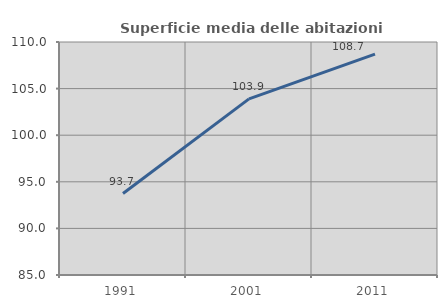
| Category | Superficie media delle abitazioni occupate |
|---|---|
| 1991.0 | 93.738 |
| 2001.0 | 103.894 |
| 2011.0 | 108.704 |